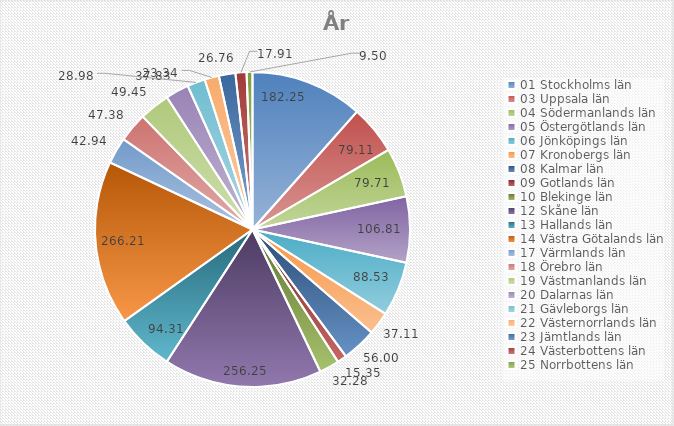
| Category | Series 0 |
|---|---|
| 01 Stockholms län | 182.25 |
| 03 Uppsala län | 79.11 |
| 04 Södermanlands län | 79.71 |
| 05 Östergötlands län | 106.81 |
| 06 Jönköpings län | 88.53 |
| 07 Kronobergs län | 37.11 |
| 08 Kalmar län | 56 |
| 09 Gotlands län | 15.35 |
| 10 Blekinge län | 32.28 |
| 12 Skåne län | 256.25 |
| 13 Hallands län | 94.31 |
| 14 Västra Götalands län | 266.21 |
| 17 Värmlands län | 42.94 |
| 18 Örebro län | 47.38 |
| 19 Västmanlands län | 49.45 |
| 20 Dalarnas län | 37.83 |
| 21 Gävleborgs län | 28.98 |
| 22 Västernorrlands län | 23.34 |
| 23 Jämtlands län | 26.76 |
| 24 Västerbottens län | 17.91 |
| 25 Norrbottens län | 9.5 |